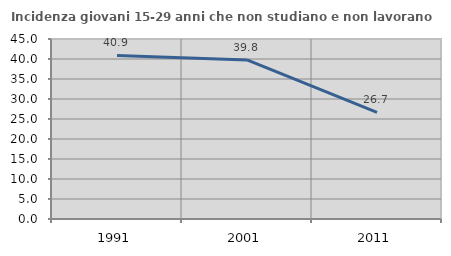
| Category | Incidenza giovani 15-29 anni che non studiano e non lavorano  |
|---|---|
| 1991.0 | 40.878 |
| 2001.0 | 39.773 |
| 2011.0 | 26.667 |